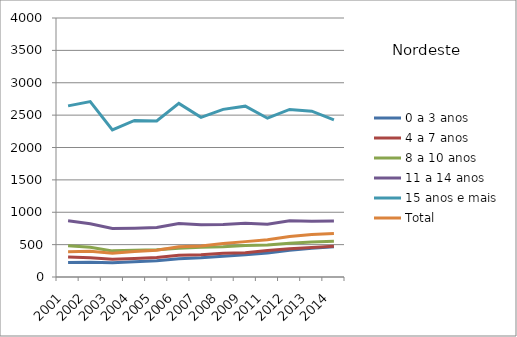
| Category | 0 a 3 anos | 4 a 7 anos | 8 a 10 anos | 11 a 14 anos | 15 anos e mais | Total |
|---|---|---|---|---|---|---|
| 2001.0 | 223.2 | 307.1 | 480.9 | 868.3 | 2642.6 | 390.4 |
| 2002.0 | 227.8 | 296.8 | 460.1 | 822.4 | 2708.8 | 395.8 |
| 2003.0 | 220 | 274.1 | 403.5 | 749 | 2270.9 | 368.2 |
| 2004.0 | 235 | 287 | 412.4 | 752.9 | 2417.2 | 394.8 |
| 2005.0 | 251.9 | 302.5 | 421.8 | 763.9 | 2409.1 | 414.6 |
| 2006.0 | 283.5 | 334.2 | 444.5 | 827.1 | 2681.3 | 468.7 |
| 2007.0 | 298.7 | 342 | 458.7 | 805.3 | 2465.7 | 480.5 |
| 2008.0 | 321.8 | 367.8 | 468.6 | 812.3 | 2589 | 517.5 |
| 2009.0 | 342.4 | 373.9 | 487.8 | 831.8 | 2638.3 | 546.3 |
| 2011.0 | 372 | 408.8 | 494.1 | 815.9 | 2452.2 | 574.1 |
| 2012.0 | 414.7 | 435.4 | 521.6 | 868.6 | 2588.4 | 626.3 |
| 2013.0 | 445.2 | 456.6 | 541.6 | 861.7 | 2560.4 | 655.5 |
| 2014.0 | 467.5 | 476.5 | 551.7 | 865.2 | 2426.4 | 671.6 |